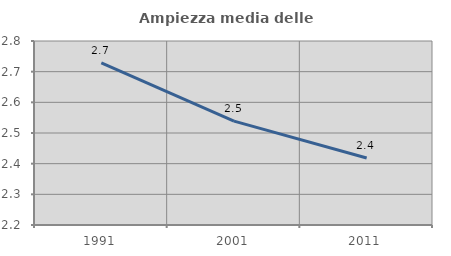
| Category | Ampiezza media delle famiglie |
|---|---|
| 1991.0 | 2.729 |
| 2001.0 | 2.539 |
| 2011.0 | 2.419 |